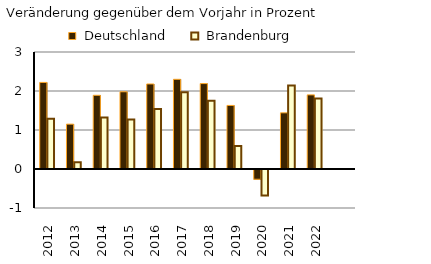
| Category |  Deutschland |  Brandenburg |
|---|---|---|
| 2012 | 2.22 | 1.29 |
| 2013 | 1.15 | 0.17 |
| 2014 | 1.89 | 1.32 |
| 2015 | 1.98 | 1.27 |
| 2016 | 2.18 | 1.54 |
| 2017 | 2.3 | 1.97 |
| 2018 | 2.19 | 1.75 |
| 2019 | 1.63 | 0.59 |
| 2020 | -0.25 | -0.68 |
| 2021 | 1.44 | 2.14 |
| 2022 | 1.9 | 1.81 |